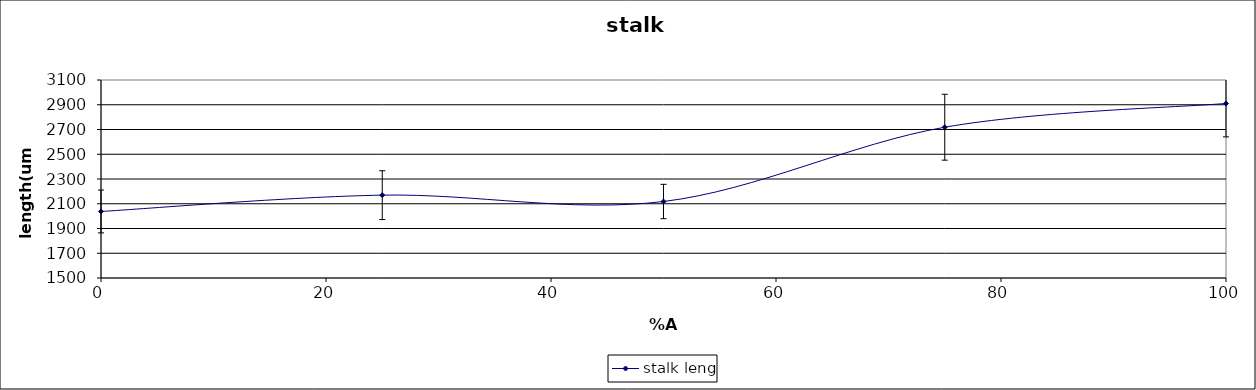
| Category | stalk leng |
|---|---|
| 0.0 | 2037.645 |
| 25.0 | 2169.593 |
| 50.0 | 2118.15 |
| 75.0 | 2718.418 |
| 100.0 | 2910.509 |